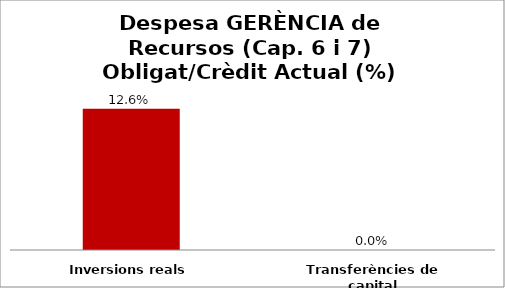
| Category | Series 0 |
|---|---|
| Inversions reals | 0.126 |
| Transferències de capital | 0 |